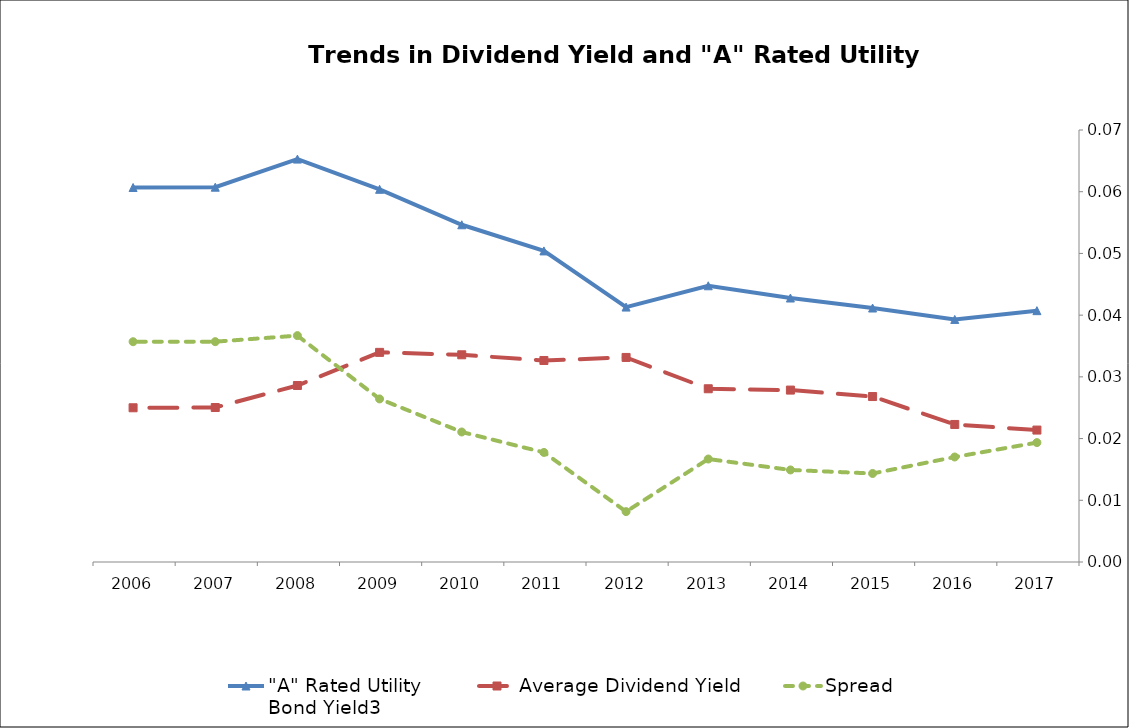
| Category | "A" Rated Utility
Bond Yield3 | Average Dividend Yield | Spread |
|---|---|---|---|
| 2017.0 | 0.041 | 0.021 | 0.019 |
| 2016.0 | 0.039 | 0.022 | 0.017 |
| 2015.0 | 0.041 | 0.027 | 0.014 |
| 2014.0 | 0.043 | 0.028 | 0.015 |
| 2013.0 | 0.045 | 0.028 | 0.017 |
| 2012.0 | 0.041 | 0.033 | 0.008 |
| 2011.0 | 0.05 | 0.033 | 0.018 |
| 2010.0 | 0.055 | 0.034 | 0.021 |
| 2009.0 | 0.06 | 0.034 | 0.026 |
| 2008.0 | 0.065 | 0.029 | 0.037 |
| 2007.0 | 0.061 | 0.025 | 0.036 |
| 2006.0 | 0.061 | 0.025 | 0.036 |